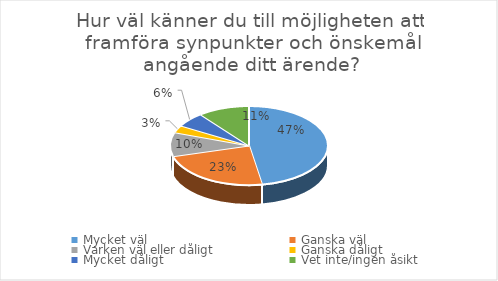
| Category | Hur väl känner du till möjligheten att framföra synpunkter och önskemål angående ditt ärende? |
|---|---|
| Mycket väl | 63 |
| Ganska väl | 31 |
| Varken väl eller dåligt | 13 |
| Ganska dåligt  | 4 |
| Mycket dåligt  | 8 |
| Vet inte/ingen åsikt | 14 |